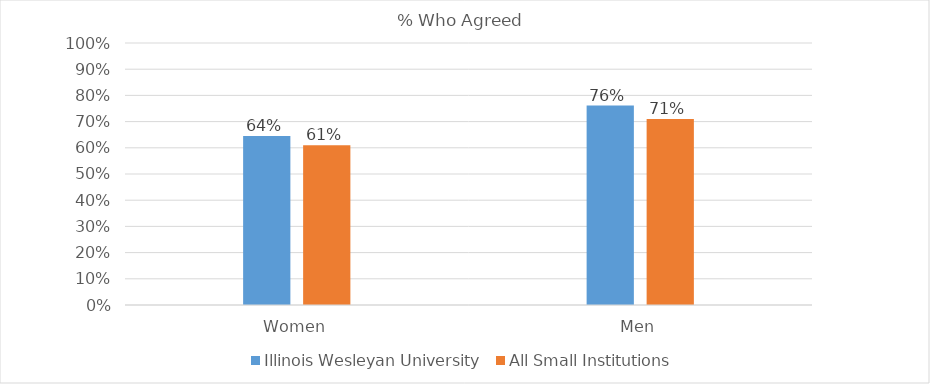
| Category | Illinois Wesleyan University | All Small Institutions |
|---|---|---|
| Women | 0.645 | 0.61 |
| Men | 0.761 | 0.71 |